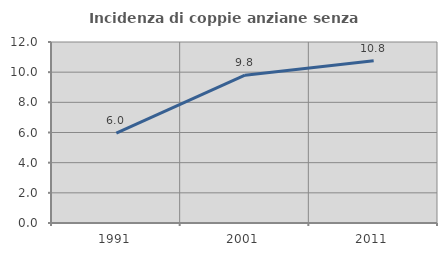
| Category | Incidenza di coppie anziane senza figli  |
|---|---|
| 1991.0 | 5.955 |
| 2001.0 | 9.798 |
| 2011.0 | 10.757 |